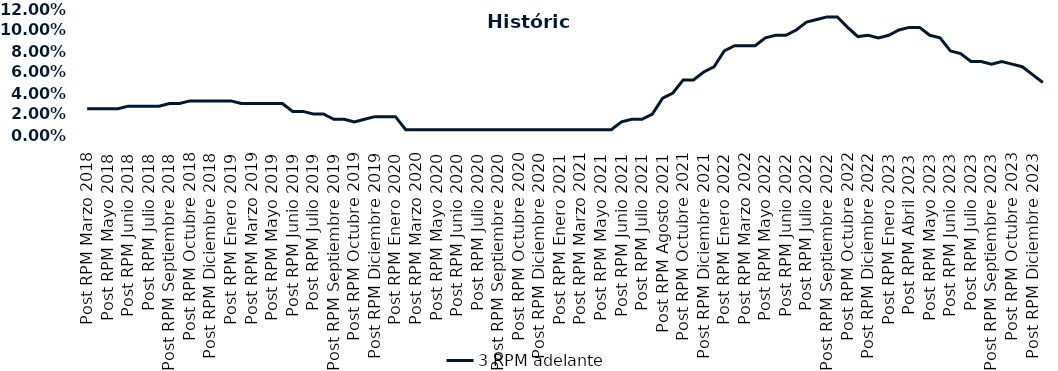
| Category | 3 RPM adelante |
|---|---|
| Post RPM Marzo 2018 | 0.025 |
| Pre RPM Mayo 2018 | 0.025 |
| Post RPM Mayo 2018 | 0.025 |
| Pre RPM Junio 2018 | 0.025 |
| Post RPM Junio 2018 | 0.028 |
| Pre RPM Julio 2018 | 0.028 |
| Post RPM Julio 2018 | 0.028 |
| Pre RPM Septiembre 2018 | 0.028 |
| Post RPM Septiembre 2018 | 0.03 |
| Pre RPM Octubre 2018 | 0.03 |
| Post RPM Octubre 2018 | 0.032 |
| Pre RPM Diciembre 2018 | 0.032 |
| Post RPM Diciembre 2018 | 0.032 |
| Pre RPM Enero 2019 | 0.032 |
| Post RPM Enero 2019 | 0.032 |
| Pre RPM Marzo 2019 | 0.03 |
| Post RPM Marzo 2019 | 0.03 |
| Pre RPM Mayo 2019 | 0.03 |
| Post RPM Mayo 2019 | 0.03 |
| Pre RPM Junio 2019 | 0.03 |
| Post RPM Junio 2019 | 0.022 |
| Pre RPM Julio 2019 | 0.022 |
| Post RPM Julio 2019 | 0.02 |
| Pre RPM Septiembre 2019 | 0.02 |
| Post RPM Septiembre 2019 | 0.015 |
| Pre RPM Octubre 2019 | 0.015 |
| Post RPM Octubre 2019 | 0.012 |
| Pre RPM Diciembre 2019 | 0.015 |
| Post RPM Diciembre 2019 | 0.018 |
| Pre RPM Enero 2020 | 0.018 |
| Post RPM Enero 2020 | 0.018 |
| Pre RPM Marzo 2020 | 0.005 |
| Post RPM Marzo 2020 | 0.005 |
| Pre RPM Mayo 2020 | 0.005 |
| Post RPM Mayo 2020 | 0.005 |
| Pre RPM Junio 2020 | 0.005 |
| Post RPM Junio 2020 | 0.005 |
| Pre RPM Julio 2020 | 0.005 |
| Post RPM Julio 2020 | 0.005 |
| Pre RPM Septiembre 2020 | 0.005 |
| Post RPM Septiembre 2020 | 0.005 |
| Pre RPM Octubre 2020 | 0.005 |
| Post RPM Octubre 2020 | 0.005 |
| Pre RPM Diciembre 2020 | 0.005 |
| Post RPM Diciembre 2020 | 0.005 |
| Pre RPM Enero 2021 | 0.005 |
| Post RPM Enero 2021 | 0.005 |
| Pre RPM Marzo 2021 | 0.005 |
| Post RPM Marzo 2021 | 0.005 |
| Pre RPM Mayo 2021 | 0.005 |
| Post RPM Mayo 2021 | 0.005 |
| Pre RPM Junio 2021 | 0.005 |
| Post RPM Junio 2021 | 0.012 |
| Pre RPM Julio 2021 | 0.015 |
| Post RPM Julio 2021 | 0.015 |
| Pre RPM Agosto 2021 | 0.02 |
| Post RPM Agosto 2021 | 0.035 |
| Pre RPM Octubre 2021 | 0.04 |
| Post RPM Octubre 2021 | 0.052 |
| Pre RPM Diciembre 2021 | 0.052 |
| Post RPM Diciembre 2021 | 0.06 |
| Pre RPM Enero 2022 | 0.065 |
| Post RPM Enero 2022 | 0.08 |
| Pre RPM Marzo 2022 | 0.085 |
| Post RPM Marzo 2022 | 0.085 |
| Pre RPM Mayo 2022 | 0.085 |
| Post RPM Mayo 2022 | 0.092 |
| Pre RPM Junio 2022 | 0.095 |
| Post RPM Junio 2022 | 0.095 |
| Pre RPM Julio 2022 | 0.1 |
| Post RPM Julio 2022 | 0.108 |
| Pre RPM Septiembre 2022 | 0.11 |
| Post RPM Septiembre 2022 | 0.112 |
| Pre RPM Octubre 2022 | 0.112 |
| Post RPM Octubre 2022 | 0.102 |
| Pre RPM Diciembre 2022 | 0.094 |
| Post RPM Diciembre 2022 | 0.095 |
| Pre RPM Enero 2023 | 0.092 |
| Post RPM Enero 2023 | 0.095 |
| Pre RPM Abril 2023 | 0.1 |
| Post RPM Abril 2023 | 0.102 |
| Pre RPM Mayo 2023 | 0.102 |
| Post RPM Mayo 2023 | 0.095 |
| Pre RPM Junio 2023 | 0.092 |
| Post RPM Junio 2023 | 0.08 |
| Pre RPM Julio 2023 | 0.078 |
| Post RPM Julio 2023 | 0.07 |
| Pre RPM Septiembre 2023 | 0.07 |
| Post RPM Septiembre 2023 | 0.068 |
| Pre RPM Octubre 2023 | 0.07 |
| Post RPM Octubre 2023 | 0.068 |
| Pre RPM Diciembre 2023 | 0.065 |
| Post RPM Diciembre 2023 | 0.058 |
| Pre RPM Enero 2024 | 0.05 |